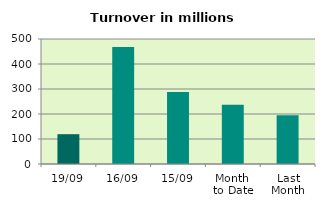
| Category | Series 0 |
|---|---|
| 19/09 | 119.205 |
| 16/09 | 467.601 |
| 15/09 | 287.703 |
| Month 
to Date | 237.137 |
| Last
Month | 195.366 |